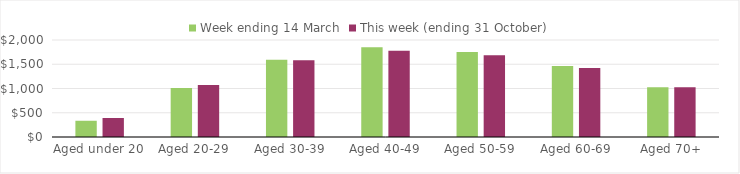
| Category | Week ending 14 March | This week (ending 31 October) |
|---|---|---|
| Aged under 20 | 334.91 | 391.74 |
| Aged 20-29 | 1011.02 | 1070.74 |
| Aged 30-39 | 1594.6 | 1583.27 |
| Aged 40-49 | 1853.09 | 1780.48 |
| Aged 50-59 | 1755.08 | 1684.31 |
| Aged 60-69 | 1466.32 | 1424.17 |
| Aged 70+ | 1024.08 | 1027.18 |